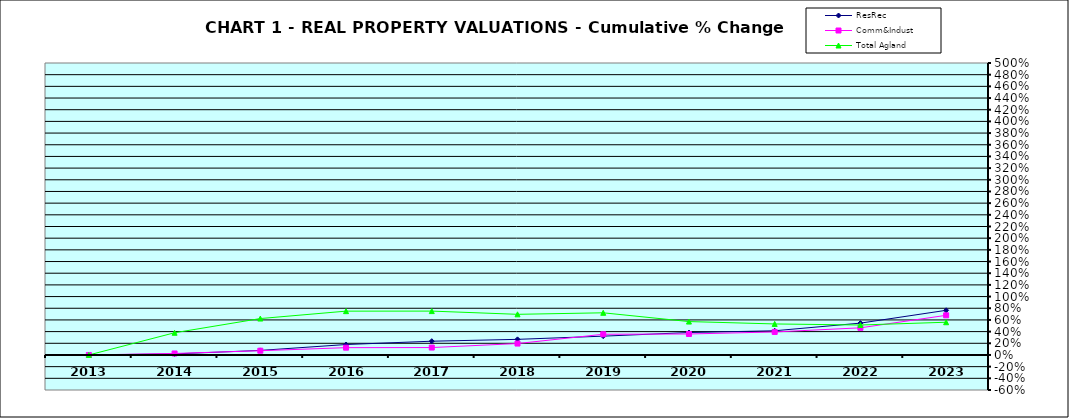
| Category | ResRec | Comm&Indust | Total Agland |
|---|---|---|---|
| 2013.0 | 0 | 0 | 0 |
| 2014.0 | 0.019 | 0.026 | 0.38 |
| 2015.0 | 0.078 | 0.073 | 0.624 |
| 2016.0 | 0.179 | 0.125 | 0.75 |
| 2017.0 | 0.235 | 0.127 | 0.751 |
| 2018.0 | 0.267 | 0.195 | 0.696 |
| 2019.0 | 0.322 | 0.355 | 0.722 |
| 2020.0 | 0.384 | 0.359 | 0.572 |
| 2021.0 | 0.415 | 0.394 | 0.531 |
| 2022.0 | 0.545 | 0.465 | 0.513 |
| 2023.0 | 0.765 | 0.679 | 0.56 |